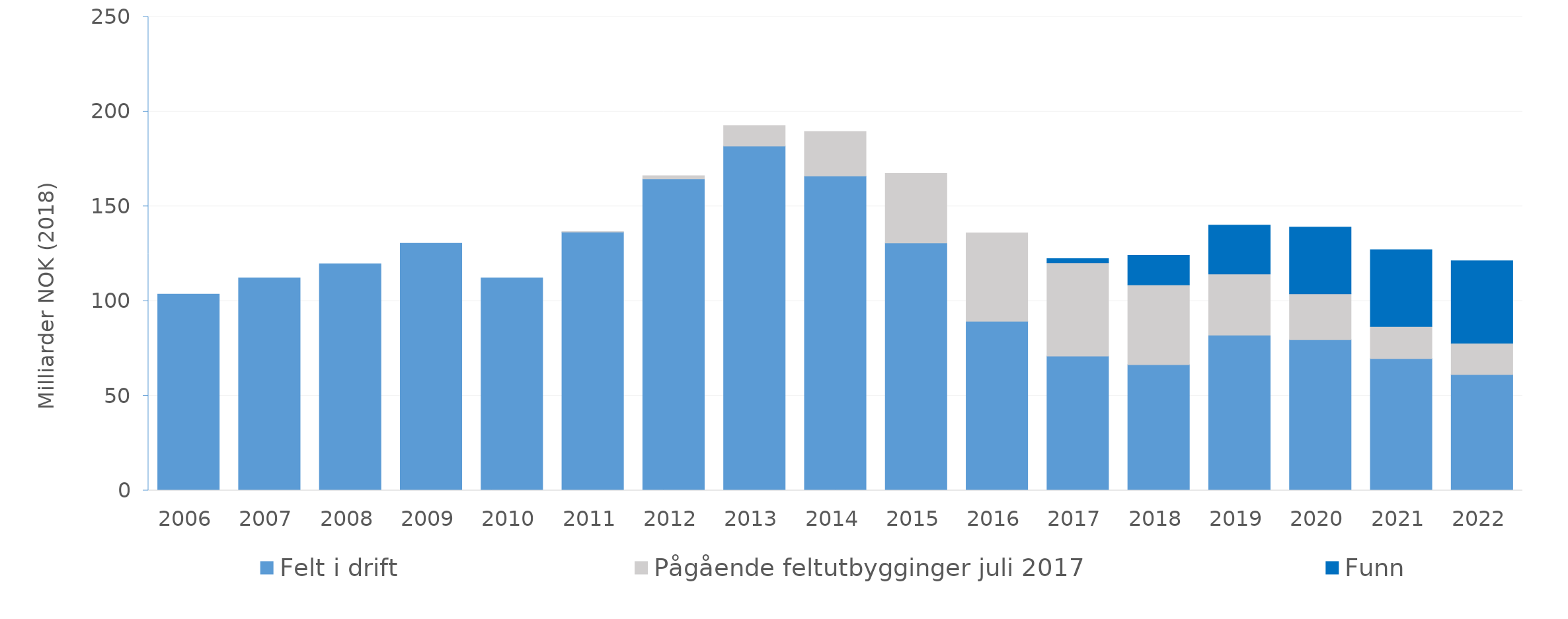
| Category | Felt i drift | Pågående feltutbygginger juli 2017 | Funn |
|---|---|---|---|
| 2006.0 | 103.686 | 0 | 0 |
| 2007.0 | 112.216 | 0 | 0 |
| 2008.0 | 119.715 | 0 | 0 |
| 2009.0 | 130.506 | 0 | 0 |
| 2010.0 | 112.198 | 0 | 0 |
| 2011.0 | 136.392 | 0.236 | 0 |
| 2012.0 | 164.445 | 1.665 | 0 |
| 2013.0 | 181.815 | 10.851 | 0 |
| 2014.0 | 165.976 | 23.507 | 0 |
| 2015.0 | 130.657 | 36.725 | 0 |
| 2016.0 | 89.327 | 46.663 | 0 |
| 2017.0 | 70.998 | 49.21 | 2.184 |
| 2018.0 | 66.45 | 42.103 | 15.58 |
| 2019.0 | 81.989 | 32.328 | 25.751 |
| 2020.0 | 79.615 | 24.208 | 35.254 |
| 2021.0 | 69.634 | 16.889 | 40.533 |
| 2022.0 | 61.193 | 16.556 | 43.47 |